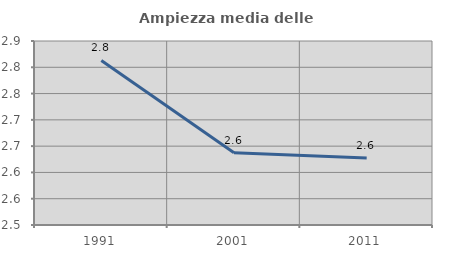
| Category | Ampiezza media delle famiglie |
|---|---|
| 1991.0 | 2.813 |
| 2001.0 | 2.637 |
| 2011.0 | 2.628 |